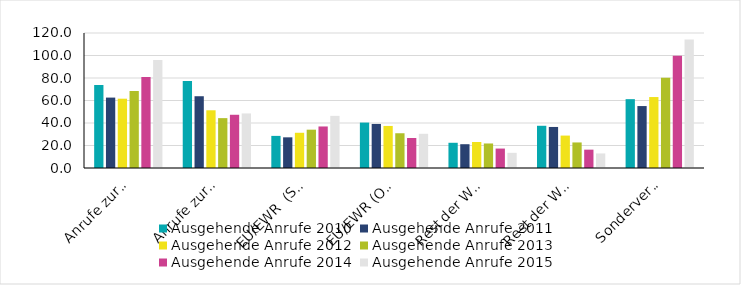
| Category | Ausgehende Anrufe 2010 | Ausgehende Anrufe 2011 | Ausgehende Anrufe 2012 | Ausgehende Anrufe 2013 | Ausgehende Anrufe 2014 | Ausgehende Anrufe 2015 |
|---|---|---|---|---|---|---|
| Anrufe zurück in die Schweiz (Standard) | 73.774 | 62.591 | 61.599 | 68.448 | 80.885 | 96.073 |
| Anrufe zurück in die Schweiz (Option) | 77.326 | 63.793 | 51.308 | 44.329 | 47.316 | 48.507 |
| EU/EWR  (Standard) | 28.543 | 27.257 | 31.313 | 34.06 | 36.916 | 46.323 |
| EU/EWR (Option) | 40.383 | 39.164 | 37.376 | 30.894 | 26.656 | 30.41 |
| Rest der Welt  (Standard) | 22.414 | 21.149 | 23.121 | 21.799 | 17.282 | 13.47 |
| Rest der Welt (Option) | 37.53 | 36.482 | 28.821 | 22.713 | 16.304 | 12.94 |
| Sondervereinbarungen | 61.188 | 55.062 | 63.073 | 80.293 | 99.813 | 114.141 |